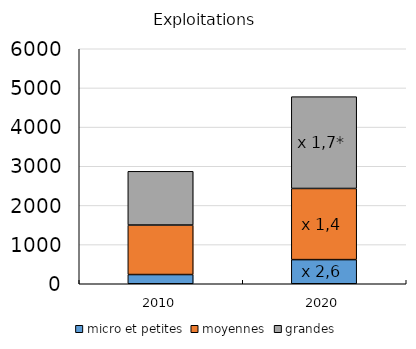
| Category | micro et petites | moyennes | grandes |
|---|---|---|---|
| 2010.0 | 235 | 1264 | 1372 |
| 2020.0 | 616 | 1817 | 2344 |